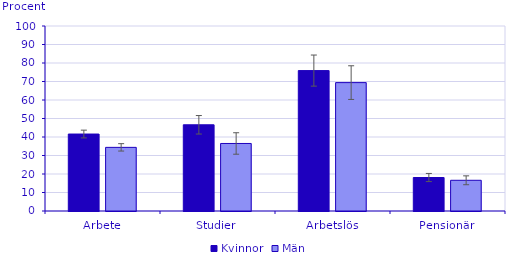
| Category | Kvinnor | Män |
|---|---|---|
| Arbete | 41.6 | 34.4 |
| Studier | 46.6 | 36.5 |
| Arbetslös | 75.9 | 69.4 |
| Pensionär | 18.1 | 16.6 |